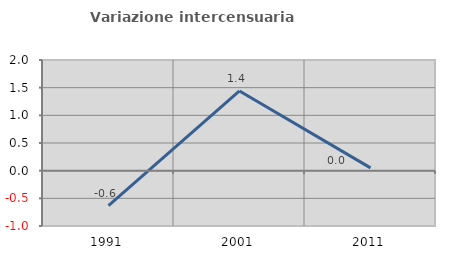
| Category | Variazione intercensuaria annua |
|---|---|
| 1991.0 | -0.634 |
| 2001.0 | 1.44 |
| 2011.0 | 0.05 |